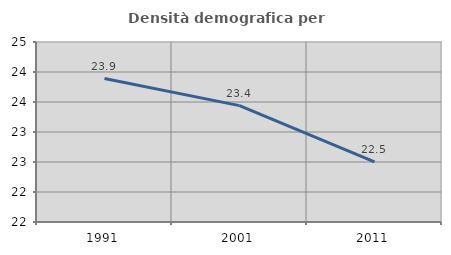
| Category | Densità demografica |
|---|---|
| 1991.0 | 23.892 |
| 2001.0 | 23.439 |
| 2011.0 | 22.5 |